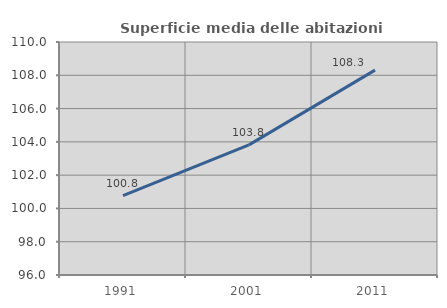
| Category | Superficie media delle abitazioni occupate |
|---|---|
| 1991.0 | 100.764 |
| 2001.0 | 103.821 |
| 2011.0 | 108.311 |